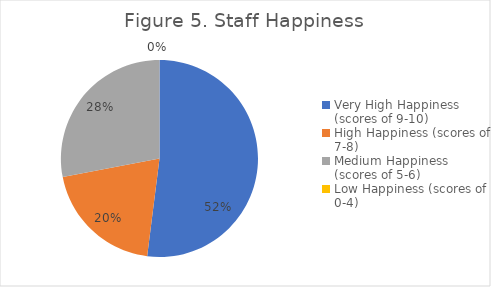
| Category | Series 0 |
|---|---|
| Very High Happiness (scores of 9-10) | 0.52 |
| High Happiness (scores of 7-8) | 0.2 |
| Medium Happiness (scores of 5-6) | 0.28 |
| Low Happiness (scores of 0-4) | 0 |